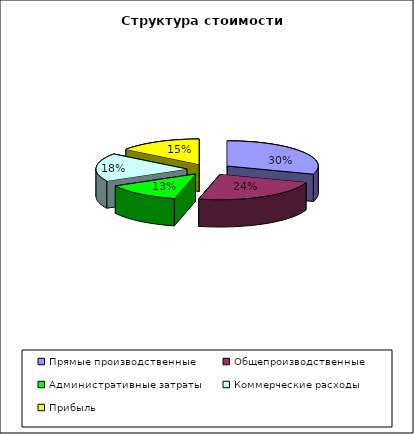
| Category | Series 0 |
|---|---|
| Прямые производственные | 1148.115 |
| Общепроизводственные | 894.453 |
| Административные затраты | 510.642 |
| Коммерческие расходы | 680.856 |
| Прибыль | 565.934 |